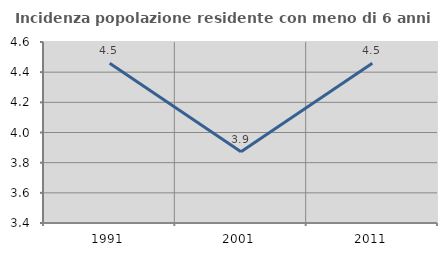
| Category | Incidenza popolazione residente con meno di 6 anni |
|---|---|
| 1991.0 | 4.459 |
| 2001.0 | 3.872 |
| 2011.0 | 4.459 |